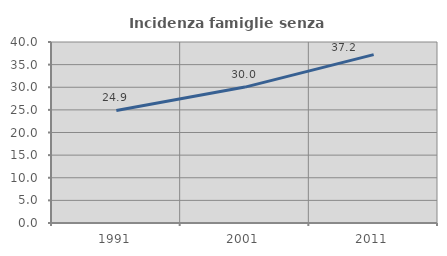
| Category | Incidenza famiglie senza nuclei |
|---|---|
| 1991.0 | 24.872 |
| 2001.0 | 30.034 |
| 2011.0 | 37.201 |